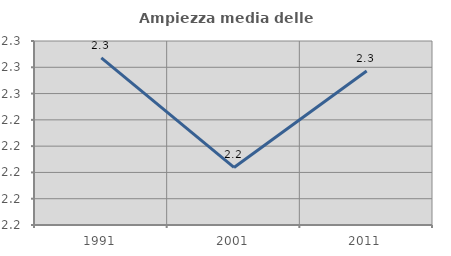
| Category | Ampiezza media delle famiglie |
|---|---|
| 1991.0 | 2.287 |
| 2001.0 | 2.204 |
| 2011.0 | 2.277 |